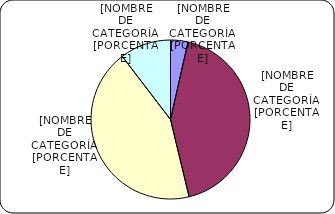
| Category | Series 0 |
|---|---|
| Menores de 3% | 436.9 |
| Entre 3% y 6% | 5275.9 |
| Entre 6% y 8% | 5358.8 |
| Entre 8% y 9% | 1284 |